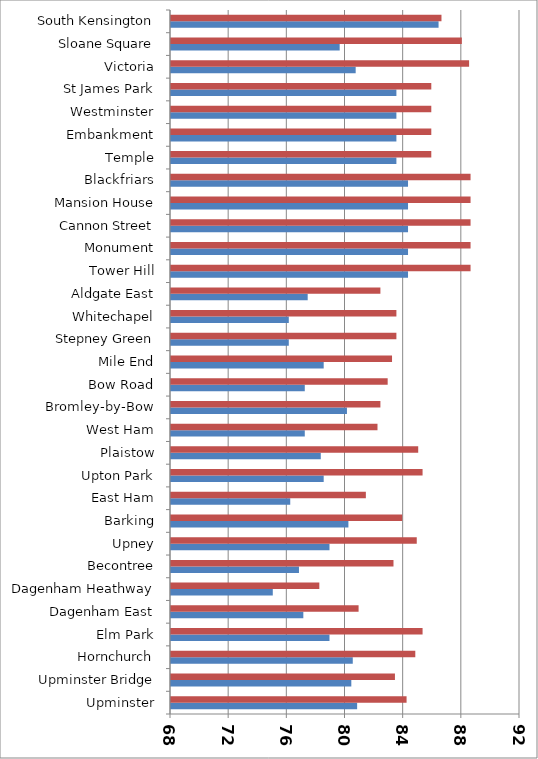
| Category | Male life expectancy (years) | Female life expectancy (years) |
|---|---|---|
| Upminster | 80.8 | 84.2 |
| Upminster Bridge | 80.4 | 83.4 |
| Hornchurch | 80.5 | 84.8 |
| Elm Park | 78.9 | 85.3 |
| Dagenham East | 77.1 | 80.9 |
| Dagenham Heathway | 75 | 78.2 |
| Becontree | 76.8 | 83.3 |
| Upney | 78.9 | 84.9 |
| Barking | 80.2 | 83.9 |
| East Ham | 76.2 | 81.4 |
| Upton Park | 78.5 | 85.3 |
| Plaistow | 78.3 | 85 |
| West Ham | 77.2 | 82.2 |
| Bromley-by-Bow | 80.1 | 82.4 |
| Bow Road | 77.2 | 82.9 |
| Mile End | 78.5 | 83.2 |
| Stepney Green | 76.1 | 83.5 |
| Whitechapel | 76.1 | 83.5 |
| Aldgate East | 77.4 | 82.4 |
| Tower Hill | 84.3 | 88.6 |
| Monument | 84.3 | 88.6 |
| Cannon Street | 84.3 | 88.6 |
| Mansion House | 84.3 | 88.6 |
| Blackfriars | 84.3 | 88.6 |
| Temple | 83.5 | 85.9 |
| Embankment | 83.5 | 85.9 |
| Westminster | 83.5 | 85.9 |
| St James Park | 83.5 | 85.9 |
| Victoria | 80.7 | 88.5 |
| Sloane Square | 79.6 | 88 |
| South Kensington | 86.4 | 86.6 |